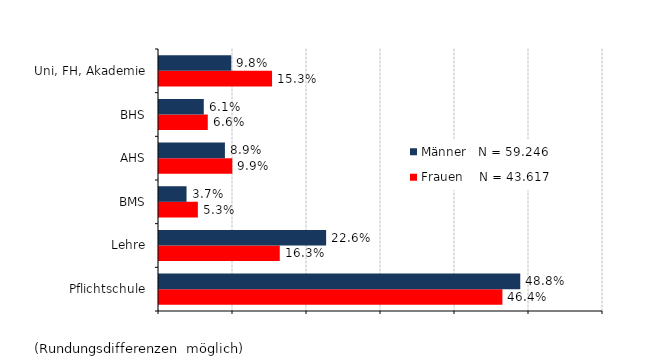
| Category | Frauen    N = 43.617 | Männer   N = 59.246 |
|---|---|---|
| Pflichtschule | 0.464 | 0.488 |
| Lehre | 0.163 | 0.226 |
| BMS | 0.053 | 0.037 |
| AHS | 0.099 | 0.089 |
| BHS | 0.066 | 0.061 |
| Uni, FH, Akademie | 0.153 | 0.098 |